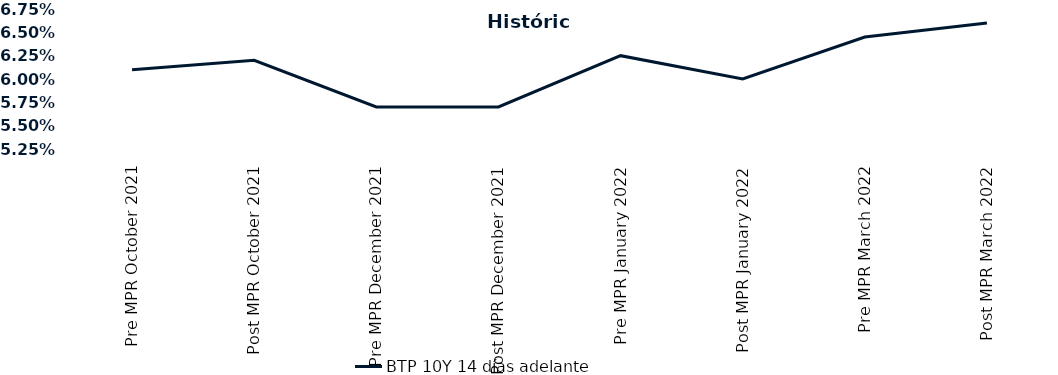
| Category | BTP 10Y 14 días adelante |
|---|---|
| Pre MPR October 2021 | 0.061 |
| Post MPR October 2021 | 0.062 |
| Pre MPR December 2021 | 0.057 |
| Post MPR December 2021 | 0.057 |
| Pre MPR January 2022 | 0.062 |
| Post MPR January 2022 | 0.06 |
| Pre MPR March 2022 | 0.064 |
| Post MPR March 2022 | 0.066 |